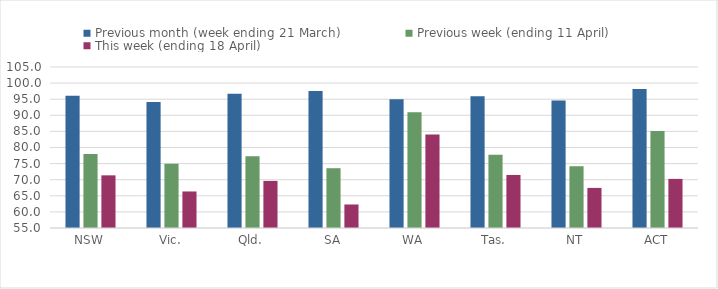
| Category | Previous month (week ending 21 March) | Previous week (ending 11 April) | This week (ending 18 April) |
|---|---|---|---|
| NSW | 96.053 | 77.997 | 71.352 |
| Vic. | 94.152 | 74.918 | 66.35 |
| Qld. | 96.655 | 77.275 | 69.622 |
| SA | 97.516 | 73.566 | 62.305 |
| WA | 94.99 | 90.982 | 84.031 |
| Tas. | 95.916 | 77.771 | 71.476 |
| NT | 94.584 | 74.178 | 67.454 |
| ACT | 98.205 | 85.111 | 70.254 |